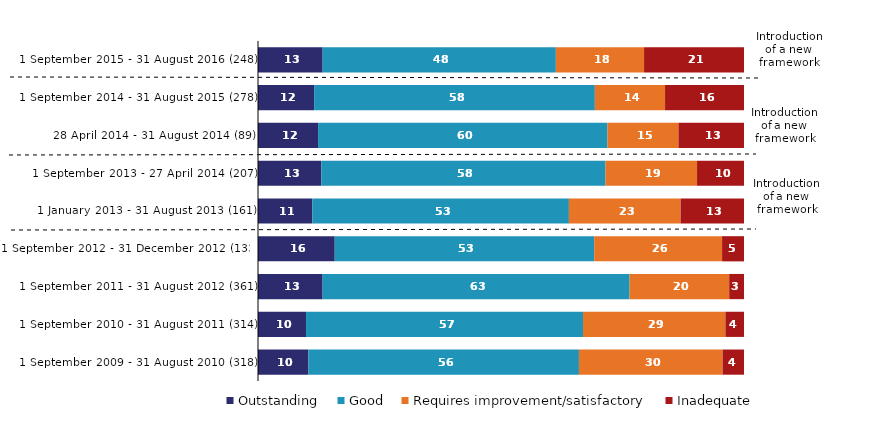
| Category | Outstanding | Good | Requires improvement/satisfactory | Inadequate |
|---|---|---|---|---|
| 1 September 2015 - 31 August 2016 (248) | 13.306 | 47.984 | 18.145 | 20.565 |
| 1 September 2014 - 31 August 2015 (278) | 11.552 | 57.762 | 14.44 | 16.245 |
| 28 April 2014 - 31 August 2014 (89) | 12.36 | 59.551 | 14.607 | 13.483 |
| 1 September 2013 - 27 April 2014 (207) | 13.043 | 58.454 | 18.841 | 9.662 |
| 1 January 2013 - 31 August 2013 (161) | 11.18 | 52.795 | 22.981 | 13.043 |
| 1 September 2012 - 31 December 2012 (133) | 15.789 | 53.383 | 26.316 | 4.511 |
| 1 September 2011 - 31 August 2012 (361) | 13.296 | 63.158 | 20.499 | 3.047 |
| 1 September 2010 - 31 August 2011 (314) | 9.873 | 57.006 | 29.299 | 3.822 |
| 1 September 2009 - 31 August 2010 (318) | 10.377 | 55.66 | 29.56 | 4.403 |